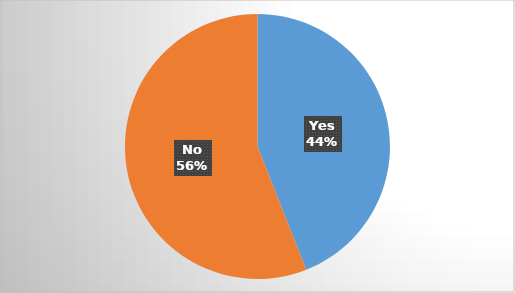
| Category | Lead Actress |
|---|---|
| Yes | 0.44 |
| No | 0.56 |